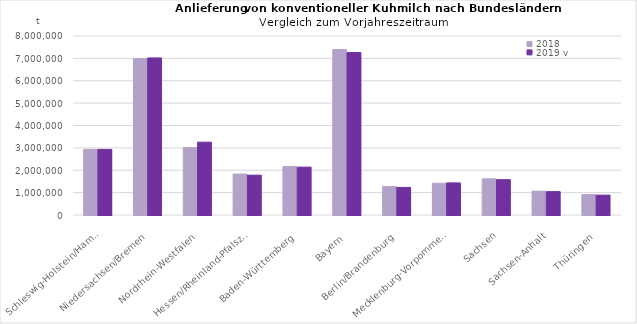
| Category | 2018 | 2019 v |
|---|---|---|
| Schleswig-Holstein/Hamburg | 2932302.81 | 2932517.059 |
| Niedersachsen/Bremen | 6986196.468 | 7019651.158 |
| Nordrhein-Westfalen | 3011117.116 | 3254577.269 |
| Hessen/Rheinland-PfalszSaarland | 1828437.359 | 1779715.838 |
| Baden-Württemberg | 2169302.093 | 2138576.098 |
| Bayern | 7392668.979 | 7259667.135 |
| Berlin/Brandenburg | 1268798.974 | 1233217.978 |
| Mecklenburg-Vorpommern | 1417835.297 | 1434139.722 |
| Sachsen | 1615304.216 | 1578260.13 |
| Sachsen-Anhalt | 1065536.781 | 1044234.522 |
| Thüringen | 911634.452 | 887789.151 |